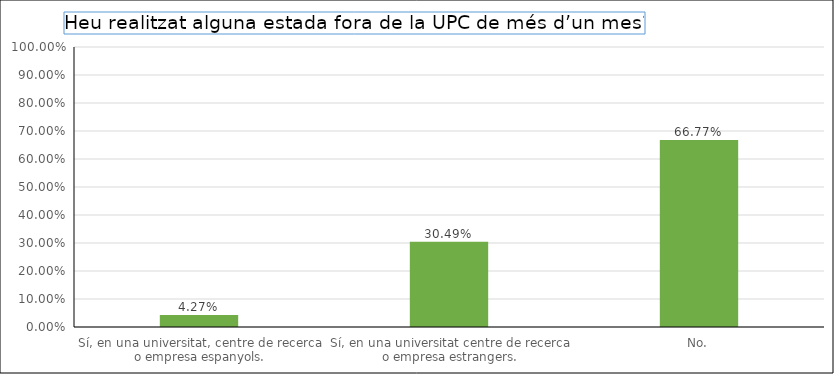
| Category | Series 0 |
|---|---|
| Sí, en una universitat, centre de recerca o empresa espanyols. | 0.043 |
| Sí, en una universitat centre de recerca o empresa estrangers. | 0.305 |
| No. | 0.668 |